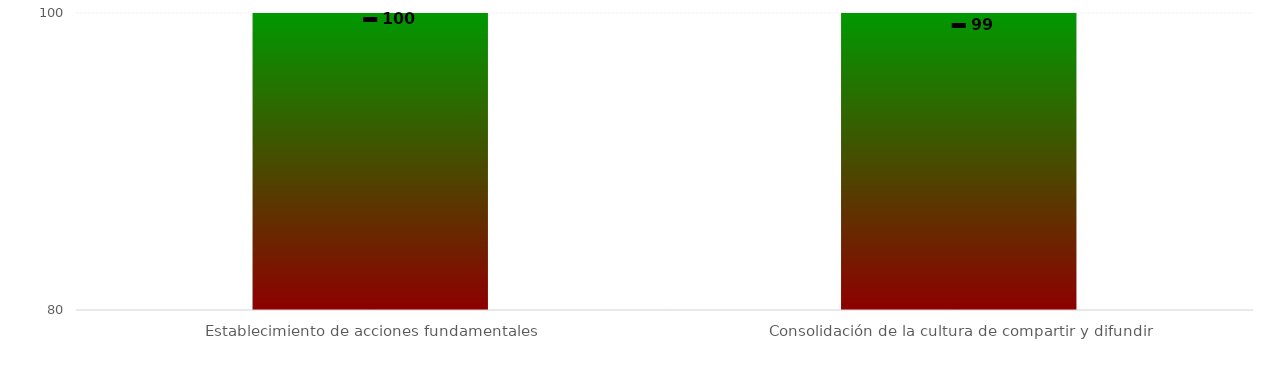
| Category | Niveles |
|---|---|
| Establecimiento de acciones fundamentales | 100 |
| Consolidación de la cultura de compartir y difundir | 100 |